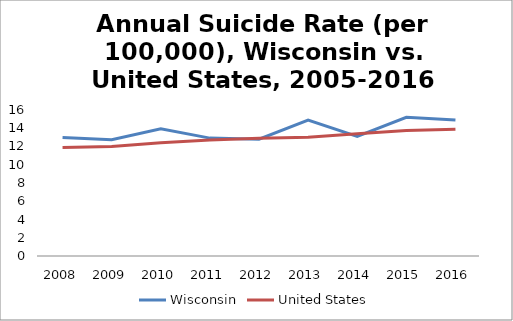
| Category | Wisconsin | United States |
|---|---|---|
| 2008.0 | 12.99 | 11.9 |
| 2009.0 | 12.75 | 12 |
| 2010.0 | 13.93 | 12.4 |
| 2011.0 | 12.92 | 12.7 |
| 2012.0 | 12.8 | 12.9 |
| 2013.0 | 14.9 | 13.02 |
| 2014.0 | 13.1 | 13.41 |
| 2015.0 | 15.2 | 13.75 |
| 2016.0 | 14.9 | 13.9 |